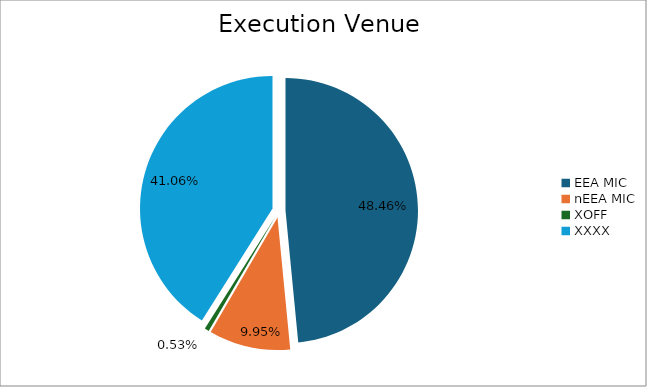
| Category | Series 0 |
|---|---|
| EEA MIC | 6975689.475 |
| nEEA MIC | 1431567.53 |
| XOFF | 76772.645 |
| XXXX | 5909420.304 |